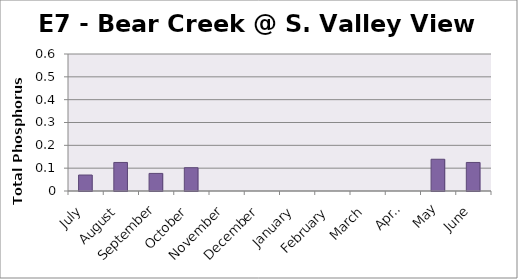
| Category | Phosphorus (mg/L) |
|---|---|
| July | 0.07 |
| August | 0.125 |
| September | 0.077 |
| October | 0.102 |
| November | 0 |
| December | 0 |
| January | 0 |
| February | 0 |
| March | 0 |
| April | 0 |
| May | 0.139 |
| June | 0.125 |